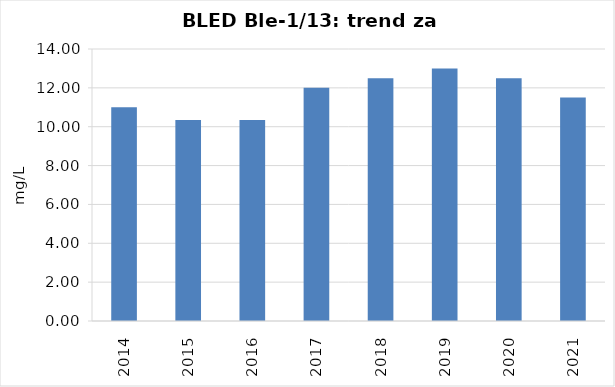
| Category | Vsota |
|---|---|
| 2014 | 11 |
| 2015 | 10.35 |
| 2016 | 10.35 |
| 2017 | 12 |
| 2018 | 12.5 |
| 2019 | 13 |
| 2020 | 12.5 |
| 2021 | 11.5 |